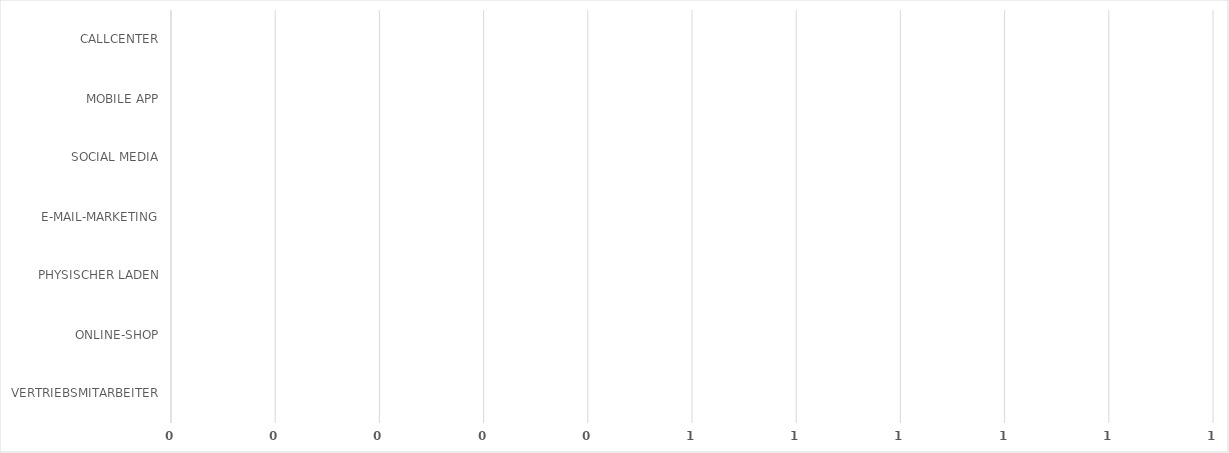
| Category | Series 0 |
|---|---|
| VERTRIEBSMITARBEITER | 0 |
| ONLINE-SHOP | 0 |
| PHYSISCHER LADEN | 0 |
| E-MAIL-MARKETING | 0 |
| SOCIAL MEDIA | 0 |
| MOBILE APP | 0 |
| CALLCENTER | 0 |